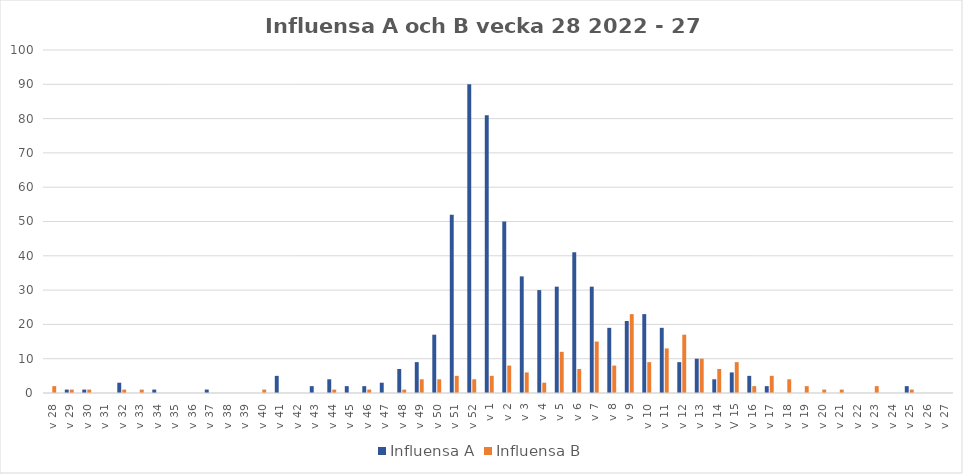
| Category | Influensa A | Influensa B |
|---|---|---|
| v 28 | 0 | 2 |
| v 29 | 1 | 1 |
| v 30 | 1 | 1 |
| v 31 | 0 | 0 |
| v 32 | 3 | 1 |
| v 33 | 0 | 1 |
| v 34 | 1 | 0 |
| v 35 | 0 | 0 |
| v 36 | 0 | 0 |
| v 37 | 1 | 0 |
| v 38 | 0 | 0 |
| v 39 | 0 | 0 |
| v 40 | 0 | 1 |
| v 41 | 5 | 0 |
| v 42 | 0 | 0 |
| v 43 | 2 | 0 |
| v 44 | 4 | 1 |
| v 45 | 2 | 0 |
| v 46 | 2 | 1 |
| v 47 | 3 | 0 |
| v 48 | 7 | 1 |
| v 49 | 9 | 4 |
| v 50 | 17 | 4 |
| v 51 | 52 | 5 |
| v 52 | 90 | 4 |
| v 1 | 81 | 5 |
| v 2 | 50 | 8 |
| v 3 | 34 | 6 |
| v 4 | 30 | 3 |
| v 5 | 31 | 12 |
| v 6 | 41 | 7 |
| v 7 | 31 | 15 |
| v 8 | 19 | 8 |
| v 9 | 21 | 23 |
| v 10 | 23 | 9 |
| v 11 | 19 | 13 |
| v 12 | 9 | 17 |
| v 13 | 10 | 10 |
| v 14 | 4 | 7 |
| V 15 | 6 | 9 |
| v 16 | 5 | 2 |
| v 17 | 2 | 5 |
| v 18 | 0 | 4 |
| v 19 | 0 | 2 |
| v 20 | 0 | 1 |
| v 21 | 0 | 1 |
| v 22 | 0 | 0 |
| v 23 | 0 | 2 |
| v 24 | 0 | 0 |
| v 25 | 2 | 1 |
| v 26 | 0 | 0 |
| v 27 | 0 | 0 |